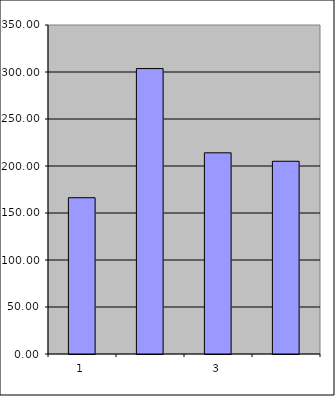
| Category | Series 0 |
|---|---|
| 0 | 166.25 |
| 1 | 303.649 |
| 2 | 214.023 |
| 3 | 205.031 |